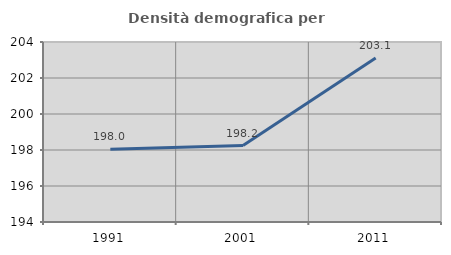
| Category | Densità demografica |
|---|---|
| 1991.0 | 198.037 |
| 2001.0 | 198.248 |
| 2011.0 | 203.105 |